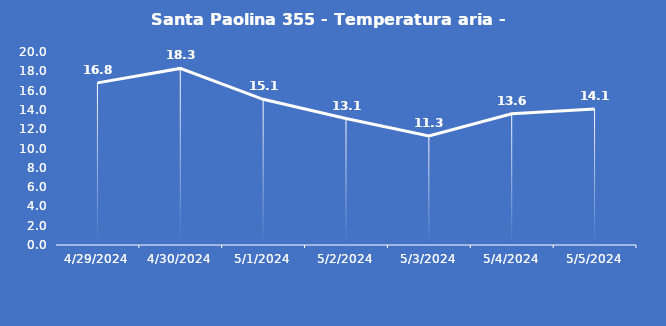
| Category | Santa Paolina 355 - Temperatura aria - Grezzo (°C) |
|---|---|
| 4/29/24 | 16.8 |
| 4/30/24 | 18.3 |
| 5/1/24 | 15.1 |
| 5/2/24 | 13.1 |
| 5/3/24 | 11.3 |
| 5/4/24 | 13.6 |
| 5/5/24 | 14.1 |